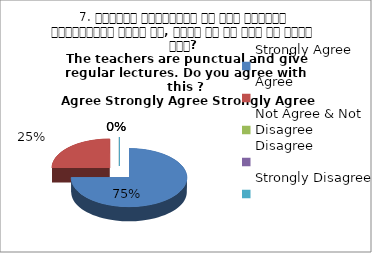
| Category | 7. शिक्षक समयनिष्ट है एवं नियमित व्याख्यान देते है, क्या आप इस बात से सहमत हैं? 
The teachers are punctual and give regular lectures. Do you agree with this ?
 Agree Strongly Agree Strongly Agree Strongly Agree |
|---|---|
| Strongly Agree | 3 |
| Agree | 1 |
| Not Agree & Not Disagree | 0 |
| Disagree | 0 |
| Strongly Disagree | 0 |